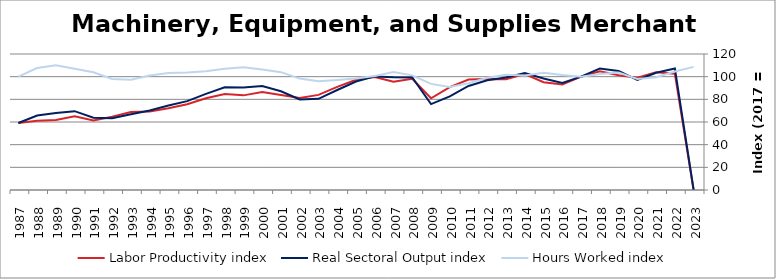
| Category | Labor Productivity index | Real Sectoral Output index | Hours Worked index |
|---|---|---|---|
| 2023.0 | 0 | 0 | 108.628 |
| 2022.0 | 102.592 | 107.293 | 104.582 |
| 2021.0 | 103.975 | 103.503 | 99.546 |
| 2020.0 | 99.056 | 97.047 | 97.972 |
| 2019.0 | 101.324 | 105.088 | 103.715 |
| 2018.0 | 104.716 | 107.223 | 102.394 |
| 2017.0 | 100 | 100 | 100 |
| 2016.0 | 93.18 | 94.522 | 101.439 |
| 2015.0 | 95.153 | 98.417 | 103.43 |
| 2014.0 | 102.283 | 103.294 | 100.988 |
| 2013.0 | 97.647 | 99.208 | 101.598 |
| 2012.0 | 97.878 | 96.902 | 99.003 |
| 2011.0 | 97.432 | 91.767 | 94.186 |
| 2010.0 | 90.754 | 82.572 | 90.984 |
| 2009.0 | 80.933 | 75.775 | 93.626 |
| 2008.0 | 98.121 | 99.256 | 101.157 |
| 2007.0 | 95.578 | 99.425 | 104.026 |
| 2006.0 | 99.613 | 100.242 | 100.631 |
| 2005.0 | 97.266 | 95.73 | 98.421 |
| 2004.0 | 91.03 | 88.259 | 96.956 |
| 2003.0 | 83.914 | 80.438 | 95.858 |
| 2002.0 | 81.251 | 79.877 | 98.309 |
| 2001.0 | 83.827 | 87.147 | 103.961 |
| 2000.0 | 86.365 | 91.813 | 106.308 |
| 1999.0 | 83.499 | 90.511 | 108.397 |
| 1998.0 | 84.622 | 90.616 | 107.083 |
| 1997.0 | 81.016 | 84.836 | 104.715 |
| 1996.0 | 75.694 | 78.423 | 103.605 |
| 1995.0 | 72.162 | 74.517 | 103.263 |
| 1994.0 | 69.333 | 70.075 | 101.071 |
| 1993.0 | 68.796 | 66.91 | 97.259 |
| 1992.0 | 64.643 | 63.316 | 97.946 |
| 1991.0 | 61.437 | 63.811 | 103.864 |
| 1990.0 | 64.975 | 69.573 | 107.076 |
| 1989.0 | 61.757 | 67.995 | 110.101 |
| 1988.0 | 61.115 | 65.765 | 107.607 |
| 1987.0 | 59.051 | 59.075 | 100.042 |